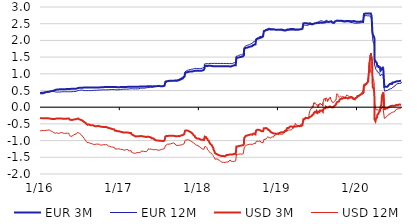
| Category | EUR 3M | EUR 12M | USD 3M | USD 12M |
|---|---|---|---|---|
| 2016-01-04 | 0.422 | 0.402 | -0.322 | -0.709 |
| 2016-01-05 | 0.423 | 0.401 | -0.327 | -0.713 |
| 2016-01-06 | 0.426 | 0.404 | -0.33 | -0.705 |
| 2016-01-07 | 0.432 | 0.409 | -0.327 | -0.687 |
| 2016-01-08 | 0.433 | 0.409 | -0.331 | -0.695 |
| 2016-01-11 | 0.433 | 0.4 | -0.332 | -0.704 |
| 2016-01-12 | 0.434 | 0.402 | -0.334 | -0.706 |
| 2016-01-13 | 0.434 | 0.401 | -0.332 | -0.713 |
| 2016-01-14 | 0.433 | 0.402 | -0.331 | -0.709 |
| 2016-01-15 | 0.432 | 0.401 | -0.33 | -0.695 |
| 2016-01-18 | 0.432 | 0.401 | -0.33 | -0.695 |
| 2016-01-19 | 0.432 | 0.401 | -0.33 | -0.695 |
| 2016-01-20 | 0.432 | 0.401 | -0.33 | -0.695 |
| 2016-01-21 | 0.432 | 0.401 | -0.33 | -0.695 |
| 2016-01-22 | 0.432 | 0.401 | -0.33 | -0.695 |
| 2016-01-25 | 0.445 | 0.422 | -0.331 | -0.703 |
| 2016-01-26 | 0.448 | 0.425 | -0.331 | -0.701 |
| 2016-01-27 | 0.449 | 0.428 | -0.328 | -0.7 |
| 2016-01-28 | 0.45 | 0.428 | -0.326 | -0.701 |
| 2016-01-29 | 0.452 | 0.435 | -0.323 | -0.69 |
| 2016-02-01 | 0.452 | 0.44 | -0.329 | -0.69 |
| 2016-02-02 | 0.451 | 0.441 | -0.329 | -0.688 |
| 2016-02-03 | 0.452 | 0.442 | -0.331 | -0.68 |
| 2016-02-04 | 0.456 | 0.448 | -0.33 | -0.679 |
| 2016-02-05 | 0.457 | 0.452 | -0.33 | -0.686 |
| 2016-02-08 | 0.459 | 0.455 | -0.331 | -0.69 |
| 2016-02-09 | 0.451 | 0.454 | -0.34 | -0.681 |
| 2016-02-10 | 0.455 | 0.451 | -0.338 | -0.684 |
| 2016-02-11 | 0.459 | 0.456 | -0.337 | -0.667 |
| 2016-02-12 | 0.463 | 0.459 | -0.338 | -0.666 |
| 2016-02-15 | 0.463 | 0.458 | -0.338 | -0.678 |
| 2016-02-16 | 0.467 | 0.462 | -0.338 | -0.682 |
| 2016-02-17 | 0.469 | 0.461 | -0.339 | -0.685 |
| 2016-02-18 | 0.475 | 0.464 | -0.338 | -0.692 |
| 2016-02-19 | 0.478 | 0.467 | -0.338 | -0.69 |
| 2016-02-22 | 0.479 | 0.468 | -0.345 | -0.709 |
| 2016-02-23 | 0.48 | 0.466 | -0.349 | -0.707 |
| 2016-02-24 | 0.481 | 0.465 | -0.355 | -0.705 |
| 2016-02-25 | 0.481 | 0.465 | -0.356 | -0.71 |
| 2016-02-26 | 0.482 | 0.467 | -0.355 | -0.711 |
| 2016-02-29 | 0.485 | 0.474 | -0.353 | -0.729 |
| 2016-03-01 | 0.487 | 0.476 | -0.352 | -0.729 |
| 2016-03-02 | 0.488 | 0.474 | -0.355 | -0.746 |
| 2016-03-03 | 0.493 | 0.475 | -0.356 | -0.75 |
| 2016-03-04 | 0.495 | 0.478 | -0.353 | -0.744 |
| 2016-03-07 | 0.496 | 0.474 | -0.356 | -0.762 |
| 2016-03-08 | 0.501 | 0.475 | -0.355 | -0.757 |
| 2016-03-09 | 0.504 | 0.473 | -0.355 | -0.759 |
| 2016-03-10 | 0.509 | 0.475 | -0.352 | -0.761 |
| 2016-03-11 | 0.515 | 0.459 | -0.344 | -0.774 |
| 2016-03-14 | 0.516 | 0.458 | -0.35 | -0.781 |
| 2016-03-15 | 0.517 | 0.456 | -0.352 | -0.787 |
| 2016-03-16 | 0.52 | 0.454 | -0.349 | -0.795 |
| 2016-03-17 | 0.524 | 0.453 | -0.333 | -0.752 |
| 2016-03-18 | 0.525 | 0.453 | -0.334 | -0.761 |
| 2016-03-21 | 0.528 | 0.452 | -0.335 | -0.764 |
| 2016-03-22 | 0.529 | 0.452 | -0.338 | -0.774 |
| 2016-03-23 | 0.531 | 0.453 | -0.34 | -0.787 |
| 2016-03-24 | 0.532 | 0.455 | -0.339 | -0.781 |
| 2016-03-29 | 0.532 | 0.456 | -0.341 | -0.789 |
| 2016-03-30 | 0.533 | 0.454 | -0.335 | -0.764 |
| 2016-03-31 | 0.534 | 0.455 | -0.339 | -0.76 |
| 2016-04-01 | 0.535 | 0.452 | -0.339 | -0.763 |
| 2016-04-04 | 0.536 | 0.451 | -0.34 | -0.772 |
| 2016-04-05 | 0.538 | 0.454 | -0.337 | -0.755 |
| 2016-04-06 | 0.538 | 0.455 | -0.341 | -0.762 |
| 2016-04-07 | 0.537 | 0.457 | -0.339 | -0.756 |
| 2016-04-08 | 0.538 | 0.46 | -0.341 | -0.755 |
| 2016-04-11 | 0.541 | 0.461 | -0.34 | -0.758 |
| 2016-04-12 | 0.539 | 0.462 | -0.34 | -0.759 |
| 2016-04-13 | 0.539 | 0.463 | -0.338 | -0.768 |
| 2016-04-14 | 0.541 | 0.461 | -0.343 | -0.771 |
| 2016-04-15 | 0.539 | 0.461 | -0.343 | -0.771 |
| 2016-04-18 | 0.539 | 0.462 | -0.344 | -0.768 |
| 2016-04-19 | 0.54 | 0.461 | -0.345 | -0.775 |
| 2016-04-20 | 0.54 | 0.461 | -0.345 | -0.775 |
| 2016-04-21 | 0.54 | 0.461 | -0.345 | -0.775 |
| 2016-04-22 | 0.54 | 0.461 | -0.345 | -0.775 |
| 2016-04-25 | 0.54 | 0.463 | -0.344 | -0.789 |
| 2016-04-26 | 0.542 | 0.464 | -0.344 | -0.793 |
| 2016-04-27 | 0.541 | 0.461 | -0.348 | -0.794 |
| 2016-04-28 | 0.542 | 0.462 | -0.347 | -0.78 |
| 2016-04-29 | 0.541 | 0.462 | -0.347 | -0.78 |
| 2016-05-02 | 0.54 | 0.462 | -0.347 | -0.78 |
| 2016-05-03 | 0.541 | 0.462 | -0.343 | -0.782 |
| 2016-05-04 | 0.543 | 0.462 | -0.344 | -0.78 |
| 2016-05-05 | 0.545 | 0.463 | -0.342 | -0.78 |
| 2016-05-06 | 0.546 | 0.463 | -0.34 | -0.774 |
| 2016-05-09 | 0.548 | 0.464 | -0.34 | -0.777 |
| 2016-05-10 | 0.55 | 0.463 | -0.338 | -0.774 |
| 2016-05-11 | 0.549 | 0.462 | -0.337 | -0.775 |
| 2016-05-12 | 0.548 | 0.462 | -0.336 | -0.777 |
| 2016-05-13 | 0.547 | 0.462 | -0.338 | -0.779 |
| 2016-05-16 | 0.547 | 0.462 | -0.336 | -0.783 |
| 2016-05-17 | 0.547 | 0.461 | -0.335 | -0.792 |
| 2016-05-18 | 0.547 | 0.461 | -0.346 | -0.82 |
| 2016-05-19 | 0.548 | 0.461 | -0.364 | -0.848 |
| 2016-05-20 | 0.548 | 0.461 | -0.371 | -0.852 |
| 2016-05-23 | 0.548 | 0.462 | -0.372 | -0.853 |
| 2016-05-24 | 0.548 | 0.462 | -0.375 | -0.862 |
| 2016-05-25 | 0.548 | 0.463 | -0.377 | -0.873 |
| 2016-05-26 | 0.548 | 0.464 | -0.384 | -0.871 |
| 2016-05-27 | 0.55 | 0.465 | -0.383 | -0.867 |
| 2016-05-30 | 0.551 | 0.465 | -0.383 | -0.867 |
| 2016-05-31 | 0.551 | 0.465 | -0.396 | -0.887 |
| 2016-06-01 | 0.551 | 0.468 | -0.391 | -0.878 |
| 2016-06-02 | 0.552 | 0.467 | -0.39 | -0.882 |
| 2016-06-03 | 0.551 | 0.466 | -0.392 | -0.881 |
| 2016-06-06 | 0.552 | 0.468 | -0.371 | -0.836 |
| 2016-06-07 | 0.551 | 0.468 | -0.367 | -0.835 |
| 2016-06-08 | 0.554 | 0.468 | -0.368 | -0.828 |
| 2016-06-09 | 0.552 | 0.468 | -0.366 | -0.824 |
| 2016-06-10 | 0.553 | 0.468 | -0.366 | -0.824 |
| 2016-06-13 | 0.553 | 0.47 | -0.362 | -0.809 |
| 2016-06-14 | 0.552 | 0.471 | -0.365 | -0.803 |
| 2016-06-15 | 0.552 | 0.471 | -0.366 | -0.815 |
| 2016-06-16 | 0.554 | 0.476 | -0.357 | -0.788 |
| 2016-06-17 | 0.555 | 0.476 | -0.354 | -0.791 |
| 2016-06-20 | 0.556 | 0.478 | -0.356 | -0.802 |
| 2016-06-21 | 0.556 | 0.479 | -0.352 | -0.802 |
| 2016-06-22 | 0.558 | 0.479 | -0.35 | -0.801 |
| 2016-06-23 | 0.559 | 0.479 | -0.35 | -0.8 |
| 2016-06-24 | 0.571 | 0.497 | -0.334 | -0.755 |
| 2016-06-27 | 0.573 | 0.498 | -0.337 | -0.746 |
| 2016-06-28 | 0.571 | 0.499 | -0.341 | -0.755 |
| 2016-06-29 | 0.572 | 0.501 | -0.356 | -0.766 |
| 2016-06-30 | 0.576 | 0.501 | -0.364 | -0.78 |
| 2016-07-01 | 0.58 | 0.502 | -0.363 | -0.775 |
| 2016-07-04 | 0.581 | 0.505 | -0.366 | -0.785 |
| 2016-07-07 | 0.583 | 0.513 | -0.375 | -0.796 |
| 2016-07-08 | 0.583 | 0.509 | -0.377 | -0.803 |
| 2016-07-11 | 0.582 | 0.513 | -0.379 | -0.82 |
| 2016-07-12 | 0.581 | 0.511 | -0.383 | -0.834 |
| 2016-07-13 | 0.585 | 0.511 | -0.39 | -0.843 |
| 2016-07-14 | 0.585 | 0.511 | -0.389 | -0.848 |
| 2016-07-15 | 0.583 | 0.507 | -0.398 | -0.858 |
| 2016-07-18 | 0.585 | 0.511 | -0.406 | -0.876 |
| 2016-07-19 | 0.585 | 0.509 | -0.407 | -0.879 |
| 2016-07-20 | 0.585 | 0.509 | -0.407 | -0.879 |
| 2016-07-21 | 0.585 | 0.509 | -0.407 | -0.879 |
| 2016-07-22 | 0.585 | 0.509 | -0.407 | -0.879 |
| 2016-07-25 | 0.587 | 0.499 | -0.444 | -0.936 |
| 2016-07-26 | 0.588 | 0.498 | -0.453 | -0.949 |
| 2016-07-27 | 0.588 | 0.499 | -0.461 | -0.964 |
| 2016-07-28 | 0.586 | 0.499 | -0.466 | -0.97 |
| 2016-07-29 | 0.587 | 0.499 | -0.469 | -0.982 |
| 2016-08-01 | 0.587 | 0.498 | -0.469 | -0.984 |
| 2016-08-02 | 0.588 | 0.498 | -0.478 | -0.993 |
| 2016-08-03 | 0.589 | 0.497 | -0.488 | -1.005 |
| 2016-08-04 | 0.588 | 0.495 | -0.498 | -1.027 |
| 2016-08-05 | 0.588 | 0.497 | -0.502 | -1.025 |
| 2016-08-08 | 0.588 | 0.496 | -0.516 | -1.058 |
| 2016-08-09 | 0.588 | 0.497 | -0.526 | -1.072 |
| 2016-08-10 | 0.587 | 0.498 | -0.528 | -1.074 |
| 2016-08-11 | 0.589 | 0.499 | -0.527 | -1.07 |
| 2016-08-12 | 0.589 | 0.499 | -0.528 | -1.076 |
| 2016-08-15 | 0.588 | 0.5 | -0.514 | -1.057 |
| 2016-08-16 | 0.589 | 0.5 | -0.511 | -1.048 |
| 2016-08-17 | 0.588 | 0.499 | -0.521 | -1.07 |
| 2016-08-18 | 0.589 | 0.498 | -0.521 | -1.065 |
| 2016-08-19 | 0.588 | 0.497 | -0.527 | -1.073 |
| 2016-08-22 | 0.589 | 0.496 | -0.535 | -1.083 |
| 2016-08-23 | 0.588 | 0.497 | -0.535 | -1.081 |
| 2016-08-24 | 0.588 | 0.498 | -0.535 | -1.077 |
| 2016-08-25 | 0.588 | 0.499 | -0.539 | -1.076 |
| 2016-08-26 | 0.588 | 0.5 | -0.543 | -1.087 |
| 2016-08-29 | 0.587 | 0.5 | -0.543 | -1.087 |
| 2016-08-30 | 0.589 | 0.501 | -0.552 | -1.109 |
| 2016-08-31 | 0.589 | 0.502 | -0.549 | -1.107 |
| 2016-09-01 | 0.589 | 0.501 | -0.546 | -1.116 |
| 2016-09-02 | 0.591 | 0.502 | -0.545 | -1.109 |
| 2016-09-05 | 0.591 | 0.502 | -0.543 | -1.112 |
| 2016-09-06 | 0.593 | 0.504 | -0.551 | -1.111 |
| 2016-09-07 | 0.593 | 0.509 | -0.544 | -1.089 |
| 2016-09-08 | 0.594 | 0.51 | -0.555 | -1.09 |
| 2016-09-09 | 0.591 | 0.507 | -0.562 | -1.107 |
| 2016-09-12 | 0.593 | 0.507 | -0.566 | -1.116 |
| 2016-09-13 | 0.592 | 0.505 | -0.56 | -1.104 |
| 2016-09-14 | 0.593 | 0.504 | -0.564 | -1.106 |
| 2016-09-15 | 0.591 | 0.503 | -0.567 | -1.1 |
| 2016-09-16 | 0.591 | 0.504 | -0.567 | -1.095 |
| 2016-09-19 | 0.591 | 0.506 | -0.571 | -1.106 |
| 2016-09-20 | 0.591 | 0.507 | -0.576 | -1.115 |
| 2016-09-21 | 0.591 | 0.508 | -0.573 | -1.121 |
| 2016-09-22 | 0.591 | 0.509 | -0.567 | -1.111 |
| 2016-09-23 | 0.592 | 0.509 | -0.563 | -1.107 |
| 2016-09-26 | 0.593 | 0.51 | -0.563 | -1.105 |
| 2016-09-27 | 0.591 | 0.51 | -0.564 | -1.101 |
| 2016-09-29 | 0.591 | 0.514 | -0.556 | -1.106 |
| 2016-09-30 | 0.591 | 0.514 | -0.564 | -1.102 |
| 2016-10-03 | 0.591 | 0.514 | -0.568 | -1.109 |
| 2016-10-04 | 0.591 | 0.514 | -0.574 | -1.116 |
| 2016-10-05 | 0.592 | 0.514 | -0.578 | -1.123 |
| 2016-10-06 | 0.594 | 0.514 | -0.582 | -1.131 |
| 2016-10-07 | 0.594 | 0.513 | -0.586 | -1.137 |
| 2016-10-10 | 0.595 | 0.514 | -0.584 | -1.136 |
| 2016-10-11 | 0.596 | 0.516 | -0.587 | -1.141 |
| 2016-10-12 | 0.599 | 0.519 | -0.591 | -1.146 |
| 2016-10-13 | 0.601 | 0.521 | -0.59 | -1.137 |
| 2016-10-14 | 0.601 | 0.522 | -0.592 | -1.136 |
| 2016-10-17 | 0.601 | 0.521 | -0.588 | -1.131 |
| 2016-10-18 | 0.602 | 0.523 | -0.591 | -1.121 |
| 2016-10-19 | 0.603 | 0.523 | -0.591 | -1.114 |
| 2016-10-20 | 0.603 | 0.523 | -0.592 | -1.116 |
| 2016-10-21 | 0.602 | 0.524 | -0.592 | -1.122 |
| 2016-10-24 | 0.601 | 0.52 | -0.594 | -1.121 |
| 2016-10-25 | 0.602 | 0.521 | -0.596 | -1.128 |
| 2016-10-26 | 0.603 | 0.52 | -0.6 | -1.13 |
| 2016-10-27 | 0.602 | 0.52 | -0.597 | -1.132 |
| 2016-10-31 | 0.603 | 0.519 | -0.594 | -1.125 |
| 2016-11-01 | 0.603 | 0.519 | -0.591 | -1.126 |
| 2016-11-02 | 0.603 | 0.521 | -0.586 | -1.115 |
| 2016-11-03 | 0.603 | 0.521 | -0.591 | -1.11 |
| 2016-11-04 | 0.602 | 0.521 | -0.593 | -1.109 |
| 2016-11-07 | 0.602 | 0.52 | -0.597 | -1.118 |
| 2016-11-08 | 0.602 | 0.52 | -0.592 | -1.118 |
| 2016-11-09 | 0.602 | 0.52 | -0.596 | -1.106 |
| 2016-11-10 | 0.602 | 0.521 | -0.612 | -1.133 |
| 2016-11-11 | 0.602 | 0.519 | -0.616 | -1.138 |
| 2016-11-14 | 0.602 | 0.52 | -0.621 | -1.16 |
| 2016-11-15 | 0.602 | 0.521 | -0.616 | -1.155 |
| 2016-11-16 | 0.601 | 0.523 | -0.619 | -1.162 |
| 2016-11-18 | 0.603 | 0.527 | -0.626 | -1.171 |
| 2016-11-21 | 0.602 | 0.528 | -0.63 | -1.173 |
| 2016-11-22 | 0.603 | 0.529 | -0.635 | -1.178 |
| 2016-11-23 | 0.603 | 0.528 | -0.64 | -1.18 |
| 2016-11-24 | 0.604 | 0.529 | -0.647 | -1.193 |
| 2016-11-25 | 0.604 | 0.529 | -0.647 | -1.195 |
| 2016-11-28 | 0.604 | 0.529 | -0.645 | -1.191 |
| 2016-11-29 | 0.604 | 0.529 | -0.641 | -1.191 |
| 2016-11-30 | 0.604 | 0.53 | -0.644 | -1.189 |
| 2016-12-01 | 0.603 | 0.529 | -0.652 | -1.193 |
| 2016-12-02 | 0.603 | 0.526 | -0.656 | -1.195 |
| 2016-12-05 | 0.603 | 0.528 | -0.658 | -1.194 |
| 2016-12-06 | 0.605 | 0.529 | -0.661 | -1.196 |
| 2016-12-07 | 0.606 | 0.528 | -0.661 | -1.195 |
| 2016-12-08 | 0.608 | 0.528 | -0.663 | -1.195 |
| 2016-12-09 | 0.606 | 0.531 | -0.667 | -1.198 |
| 2016-12-12 | 0.606 | 0.531 | -0.669 | -1.205 |
| 2016-12-13 | 0.606 | 0.531 | -0.673 | -1.204 |
| 2016-12-14 | 0.606 | 0.532 | -0.68 | -1.205 |
| 2016-12-15 | 0.606 | 0.531 | -0.703 | -1.25 |
| 2016-12-16 | 0.604 | 0.531 | -0.707 | -1.243 |
| 2016-12-19 | 0.603 | 0.521 | -0.704 | -1.252 |
| 2016-12-20 | 0.603 | 0.521 | -0.706 | -1.251 |
| 2016-12-21 | 0.605 | 0.522 | -0.708 | -1.25 |
| 2016-12-22 | 0.596 | 0.522 | -0.717 | -1.248 |
| 2016-12-23 | 0.597 | 0.522 | -0.717 | -1.25 |
| 2016-12-27 | 0.598 | 0.521 | -0.717 | -1.25 |
| 2016-12-28 | 0.589 | 0.512 | -0.728 | -1.26 |
| 2016-12-29 | 0.599 | 0.521 | -0.718 | -1.247 |
| 2016-12-30 | 0.599 | 0.522 | -0.718 | -1.246 |
| 2017-01-02 | 0.598 | 0.523 | -0.718 | -1.246 |
| 2017-01-03 | 0.599 | 0.524 | -0.719 | -1.249 |
| 2017-01-04 | 0.6 | 0.525 | -0.725 | -1.249 |
| 2017-01-05 | 0.601 | 0.525 | -0.729 | -1.249 |
| 2017-01-06 | 0.601 | 0.527 | -0.73 | -1.245 |
| 2017-01-09 | 0.602 | 0.528 | -0.735 | -1.261 |
| 2017-01-10 | 0.604 | 0.53 | -0.738 | -1.262 |
| 2017-01-11 | 0.606 | 0.531 | -0.742 | -1.263 |
| 2017-01-12 | 0.607 | 0.533 | -0.742 | -1.258 |
| 2017-01-13 | 0.607 | 0.534 | -0.743 | -1.258 |
| 2017-01-16 | 0.608 | 0.535 | -0.744 | -1.262 |
| 2017-01-17 | 0.609 | 0.538 | -0.745 | -1.262 |
| 2017-01-18 | 0.609 | 0.539 | -0.75 | -1.27 |
| 2017-01-19 | 0.609 | 0.54 | -0.761 | -1.288 |
| 2017-01-20 | 0.609 | 0.54 | -0.761 | -1.288 |
| 2017-01-23 | 0.607 | 0.541 | -0.758 | -1.281 |
| 2017-01-24 | 0.608 | 0.541 | -0.752 | -1.267 |
| 2017-01-25 | 0.608 | 0.541 | -0.757 | -1.279 |
| 2017-01-26 | 0.608 | 0.542 | -0.759 | -1.288 |
| 2017-01-27 | 0.608 | 0.541 | -0.759 | -1.284 |
| 2017-01-30 | 0.608 | 0.54 | -0.754 | -1.285 |
| 2017-01-31 | 0.607 | 0.541 | -0.755 | -1.273 |
| 2017-02-01 | 0.608 | 0.543 | -0.755 | -1.275 |
| 2017-02-02 | 0.608 | 0.542 | -0.754 | -1.272 |
| 2017-02-03 | 0.608 | 0.541 | -0.754 | -1.273 |
| 2017-02-06 | 0.608 | 0.541 | -0.758 | -1.267 |
| 2017-02-07 | 0.608 | 0.541 | -0.758 | -1.265 |
| 2017-02-08 | 0.608 | 0.541 | -0.754 | -1.26 |
| 2017-02-09 | 0.608 | 0.541 | -0.754 | -1.254 |
| 2017-02-10 | 0.609 | 0.541 | -0.756 | -1.263 |
| 2017-02-13 | 0.609 | 0.542 | -0.759 | -1.27 |
| 2017-02-14 | 0.608 | 0.544 | -0.757 | -1.268 |
| 2017-02-15 | 0.608 | 0.544 | -0.762 | -1.284 |
| 2017-02-16 | 0.608 | 0.546 | -0.776 | -1.305 |
| 2017-02-17 | 0.609 | 0.549 | -0.772 | -1.295 |
| 2017-02-20 | 0.609 | 0.549 | -0.77 | -1.295 |
| 2017-02-21 | 0.609 | 0.551 | -0.773 | -1.305 |
| 2017-02-22 | 0.61 | 0.551 | -0.774 | -1.306 |
| 2017-02-23 | 0.609 | 0.551 | -0.772 | -1.304 |
| 2017-02-24 | 0.609 | 0.553 | -0.774 | -1.3 |
| 2017-02-27 | 0.609 | 0.553 | -0.775 | -1.3 |
| 2017-02-28 | 0.61 | 0.554 | -0.784 | -1.316 |
| 2017-03-01 | 0.609 | 0.554 | -0.813 | -1.35 |
| 2017-03-02 | 0.609 | 0.554 | -0.82 | -1.358 |
| 2017-03-03 | 0.609 | 0.553 | -0.822 | -1.368 |
| 2017-03-06 | 0.609 | 0.551 | -0.826 | -1.36 |
| 2017-03-07 | 0.608 | 0.551 | -0.826 | -1.36 |
| 2017-03-08 | 0.609 | 0.551 | -0.829 | -1.361 |
| 2017-03-09 | 0.609 | 0.551 | -0.84 | -1.374 |
| 2017-03-10 | 0.609 | 0.549 | -0.841 | -1.378 |
| 2017-03-13 | 0.61 | 0.548 | -0.851 | -1.381 |
| 2017-03-14 | 0.61 | 0.548 | -0.857 | -1.383 |
| 2017-03-15 | 0.609 | 0.55 | -0.868 | -1.388 |
| 2017-03-16 | 0.609 | 0.551 | -0.872 | -1.374 |
| 2017-03-17 | 0.609 | 0.549 | -0.872 | -1.373 |
| 2017-03-20 | 0.609 | 0.549 | -0.876 | -1.376 |
| 2017-03-21 | 0.609 | 0.546 | -0.876 | -1.375 |
| 2017-03-22 | 0.61 | 0.546 | -0.877 | -1.367 |
| 2017-03-23 | 0.61 | 0.547 | -0.873 | -1.364 |
| 2017-03-24 | 0.61 | 0.547 | -0.871 | -1.363 |
| 2017-03-27 | 0.61 | 0.549 | -0.872 | -1.357 |
| 2017-03-28 | 0.61 | 0.55 | -0.872 | -1.358 |
| 2017-03-29 | 0.61 | 0.549 | -0.867 | -1.354 |
| 2017-03-30 | 0.61 | 0.549 | -0.868 | -1.353 |
| 2017-03-31 | 0.609 | 0.549 | -0.87 | -1.362 |
| 2017-04-03 | 0.61 | 0.551 | -0.87 | -1.363 |
| 2017-04-04 | 0.61 | 0.551 | -0.87 | -1.352 |
| 2017-04-05 | 0.609 | 0.554 | -0.87 | -1.356 |
| 2017-04-06 | 0.61 | 0.555 | -0.875 | -1.358 |
| 2017-04-07 | 0.62 | 0.556 | -0.868 | -1.359 |
| 2017-04-10 | 0.622 | 0.568 | -0.866 | -1.348 |
| 2017-04-11 | 0.622 | 0.569 | -0.865 | -1.339 |
| 2017-04-12 | 0.622 | 0.57 | -0.868 | -1.333 |
| 2017-04-13 | 0.621 | 0.57 | -0.868 | -1.322 |
| 2017-04-18 | 0.621 | 0.572 | -0.866 | -1.311 |
| 2017-04-19 | 0.622 | 0.573 | -0.866 | -1.286 |
| 2017-04-20 | 0.622 | 0.574 | -0.863 | -1.289 |
| 2017-04-21 | 0.621 | 0.574 | -0.866 | -1.295 |
| 2017-04-24 | 0.619 | 0.571 | -0.876 | -1.318 |
| 2017-04-25 | 0.619 | 0.571 | -0.88 | -1.325 |
| 2017-04-26 | 0.619 | 0.571 | -0.882 | -1.333 |
| 2017-04-27 | 0.619 | 0.571 | -0.88 | -1.326 |
| 2017-04-28 | 0.619 | 0.571 | -0.882 | -1.324 |
| 2017-05-02 | 0.619 | 0.571 | -0.884 | -1.33 |
| 2017-05-03 | 0.619 | 0.575 | -0.881 | -1.32 |
| 2017-05-04 | 0.619 | 0.576 | -0.889 | -1.331 |
| 2017-05-05 | 0.619 | 0.574 | -0.89 | -1.329 |
| 2017-05-09 | 0.619 | 0.583 | -0.892 | -1.331 |
| 2017-05-10 | 0.619 | 0.584 | -0.891 | -1.328 |
| 2017-05-11 | 0.629 | 0.584 | -0.882 | -1.326 |
| 2017-05-12 | 0.629 | 0.587 | -0.88 | -1.306 |
| 2017-05-15 | 0.63 | 0.587 | -0.879 | -1.285 |
| 2017-05-16 | 0.631 | 0.588 | -0.881 | -1.285 |
| 2017-05-17 | 0.631 | 0.589 | -0.878 | -1.273 |
| 2017-05-18 | 0.631 | 0.589 | -0.872 | -1.245 |
| 2017-05-19 | 0.631 | 0.589 | -0.886 | -1.263 |
| 2017-05-22 | 0.629 | 0.589 | -0.892 | -1.266 |
| 2017-05-23 | 0.63 | 0.589 | -0.889 | -1.26 |
| 2017-05-24 | 0.629 | 0.599 | -0.898 | -1.256 |
| 2017-05-25 | 0.629 | 0.599 | -0.9 | -1.253 |
| 2017-05-26 | 0.629 | 0.6 | -0.902 | -1.251 |
| 2017-05-29 | 0.629 | 0.601 | -0.902 | -1.251 |
| 2017-05-30 | 0.629 | 0.591 | -0.902 | -1.262 |
| 2017-05-31 | 0.629 | 0.591 | -0.91 | -1.264 |
| 2017-06-01 | 0.629 | 0.591 | -0.918 | -1.266 |
| 2017-06-02 | 0.619 | 0.591 | -0.932 | -1.271 |
| 2017-06-05 | 0.619 | 0.591 | -0.93 | -1.266 |
| 2017-06-06 | 0.619 | 0.593 | -0.929 | -1.263 |
| 2017-06-07 | 0.619 | 0.594 | -0.931 | -1.264 |
| 2017-06-08 | 0.62 | 0.594 | -0.938 | -1.268 |
| 2017-06-09 | 0.631 | 0.6 | -0.936 | -1.268 |
| 2017-06-12 | 0.631 | 0.607 | -0.942 | -1.276 |
| 2017-06-13 | 0.631 | 0.609 | -0.946 | -1.276 |
| 2017-06-14 | 0.631 | 0.612 | -0.95 | -1.276 |
| 2017-06-15 | 0.629 | 0.612 | -0.967 | -1.27 |
| 2017-06-16 | 0.629 | 0.614 | -0.974 | -1.272 |
| 2017-06-19 | 0.629 | 0.616 | -0.98 | -1.268 |
| 2017-06-20 | 0.629 | 0.619 | -0.987 | -1.276 |
| 2017-06-21 | 0.629 | 0.621 | -0.989 | -1.275 |
| 2017-06-22 | 0.63 | 0.621 | -0.996 | -1.278 |
| 2017-06-23 | 0.631 | 0.623 | -0.993 | -1.273 |
| 2017-06-26 | 0.631 | 0.621 | -0.995 | -1.275 |
| 2017-06-27 | 0.631 | 0.621 | -0.995 | -1.273 |
| 2017-06-28 | 0.631 | 0.618 | -0.996 | -1.277 |
| 2017-06-29 | 0.621 | 0.616 | -1.009 | -1.28 |
| 2017-06-30 | 0.631 | 0.616 | -0.999 | -1.278 |
| 2017-07-03 | 0.631 | 0.617 | -1.001 | -1.288 |
| 2017-07-04 | 0.629 | 0.619 | -1.002 | -1.291 |
| 2017-07-07 | 0.631 | 0.631 | -1.005 | -1.288 |
| 2017-07-10 | 0.631 | 0.626 | -1.004 | -1.281 |
| 2017-07-11 | 0.631 | 0.625 | -1.004 | -1.282 |
| 2017-07-12 | 0.631 | 0.624 | -1.004 | -1.276 |
| 2017-07-13 | 0.631 | 0.621 | -1.004 | -1.268 |
| 2017-07-14 | 0.631 | 0.621 | -1.004 | -1.27 |
| 2017-07-17 | 0.63 | 0.621 | -1.006 | -1.263 |
| 2017-07-18 | 0.631 | 0.621 | -1.007 | -1.263 |
| 2017-07-19 | 0.632 | 0.621 | -1.007 | -1.263 |
| 2017-07-20 | 0.632 | 0.621 | -1.007 | -1.263 |
| 2017-07-21 | 0.632 | 0.621 | -1.007 | -1.263 |
| 2017-07-24 | 0.629 | 0.633 | -1.014 | -1.256 |
| 2017-07-25 | 0.629 | 0.633 | -1.017 | -1.259 |
| 2017-07-26 | 0.63 | 0.633 | -1.014 | -1.256 |
| 2017-07-27 | 0.629 | 0.633 | -1.011 | -1.25 |
| 2017-07-28 | 0.639 | 0.632 | -1.001 | -1.249 |
| 2017-07-31 | 0.64 | 0.641 | -1.001 | -1.237 |
| 2017-08-01 | 0.641 | 0.641 | -1.001 | -1.236 |
| 2017-08-02 | 0.641 | 0.643 | -1.003 | -1.236 |
| 2017-08-03 | 0.639 | 0.642 | -1.002 | -1.236 |
| 2017-08-04 | 0.759 | 0.711 | -0.882 | -1.163 |
| 2017-08-07 | 0.768 | 0.742 | -0.871 | -1.142 |
| 2017-08-08 | 0.768 | 0.752 | -0.869 | -1.13 |
| 2017-08-09 | 0.778 | 0.753 | -0.859 | -1.128 |
| 2017-08-10 | 0.779 | 0.764 | -0.859 | -1.118 |
| 2017-08-11 | 0.779 | 0.766 | -0.865 | -1.115 |
| 2017-08-14 | 0.779 | 0.768 | -0.864 | -1.108 |
| 2017-08-15 | 0.779 | 0.767 | -0.864 | -1.118 |
| 2017-08-16 | 0.779 | 0.777 | -0.867 | -1.116 |
| 2017-08-17 | 0.789 | 0.778 | -0.856 | -1.113 |
| 2017-08-18 | 0.789 | 0.778 | -0.855 | -1.106 |
| 2017-08-21 | 0.789 | 0.778 | -0.854 | -1.107 |
| 2017-08-22 | 0.788 | 0.788 | -0.857 | -1.097 |
| 2017-08-23 | 0.789 | 0.789 | -0.857 | -1.098 |
| 2017-08-24 | 0.789 | 0.789 | -0.857 | -1.093 |
| 2017-08-25 | 0.789 | 0.789 | -0.858 | -1.098 |
| 2017-08-28 | 0.789 | 0.789 | -0.858 | -1.098 |
| 2017-08-29 | 0.79 | 0.79 | -0.857 | -1.084 |
| 2017-08-30 | 0.79 | 0.791 | -0.856 | -1.082 |
| 2017-08-31 | 0.789 | 0.791 | -0.858 | -1.083 |
| 2017-09-01 | 0.789 | 0.791 | -0.856 | -1.082 |
| 2017-09-04 | 0.789 | 0.791 | -0.856 | -1.083 |
| 2017-09-05 | 0.789 | 0.791 | -0.857 | -1.085 |
| 2017-09-06 | 0.789 | 0.793 | -0.857 | -1.078 |
| 2017-09-07 | 0.79 | 0.792 | -0.857 | -1.079 |
| 2017-09-08 | 0.791 | 0.796 | -0.85 | -1.065 |
| 2017-09-11 | 0.791 | 0.798 | -0.857 | -1.069 |
| 2017-09-12 | 0.79 | 0.809 | -0.859 | -1.07 |
| 2017-09-13 | 0.789 | 0.809 | -0.86 | -1.072 |
| 2017-09-14 | 0.789 | 0.811 | -0.861 | -1.08 |
| 2017-09-15 | 0.789 | 0.811 | -0.864 | -1.092 |
| 2017-09-18 | 0.789 | 0.811 | -0.865 | -1.1 |
| 2017-09-19 | 0.79 | 0.811 | -0.866 | -1.104 |
| 2017-09-20 | 0.789 | 0.811 | -0.863 | -1.107 |
| 2017-09-21 | 0.79 | 0.811 | -0.868 | -1.128 |
| 2017-09-22 | 0.789 | 0.811 | -0.869 | -1.135 |
| 2017-09-25 | 0.789 | 0.811 | -0.87 | -1.135 |
| 2017-09-26 | 0.789 | 0.811 | -0.871 | -1.136 |
| 2017-09-27 | 0.799 | 0.811 | -0.863 | -1.145 |
| 2017-09-29 | 0.799 | 0.822 | -0.864 | -1.132 |
| 2017-10-02 | 0.799 | 0.822 | -0.866 | -1.141 |
| 2017-10-03 | 0.8 | 0.821 | -0.872 | -1.149 |
| 2017-10-04 | 0.799 | 0.818 | -0.877 | -1.148 |
| 2017-10-05 | 0.809 | 0.831 | -0.869 | -1.14 |
| 2017-10-06 | 0.819 | 0.833 | -0.86 | -1.145 |
| 2017-10-09 | 0.819 | 0.846 | -0.866 | -1.139 |
| 2017-10-10 | 0.819 | 0.851 | -0.867 | -1.137 |
| 2017-10-11 | 0.819 | 0.841 | -0.869 | -1.15 |
| 2017-10-12 | 0.819 | 0.841 | -0.869 | -1.148 |
| 2017-10-13 | 0.829 | 0.851 | -0.853 | -1.143 |
| 2017-10-16 | 0.839 | 0.862 | -0.844 | -1.13 |
| 2017-10-17 | 0.839 | 0.873 | -0.847 | -1.131 |
| 2017-10-18 | 0.849 | 0.883 | -0.843 | -1.135 |
| 2017-10-19 | 0.849 | 0.893 | -0.842 | -1.118 |
| 2017-10-20 | 0.849 | 0.893 | -0.842 | -1.118 |
| 2017-10-23 | 0.859 | 0.903 | -0.837 | -1.115 |
| 2017-10-24 | 0.87 | 0.903 | -0.831 | -1.115 |
| 2017-10-25 | 0.871 | 0.913 | -0.834 | -1.115 |
| 2017-10-26 | 0.881 | 0.923 | -0.828 | -1.103 |
| 2017-10-27 | 0.891 | 0.924 | -0.82 | -1.108 |
| 2017-10-30 | 0.901 | 0.935 | -0.807 | -1.092 |
| 2017-10-31 | 0.911 | 0.955 | -0.801 | -1.078 |
| 2017-11-01 | 0.919 | 0.957 | -0.795 | -1.086 |
| 2017-11-02 | 0.939 | 0.979 | -0.781 | -1.073 |
| 2017-11-03 | 1.019 | 1.061 | -0.702 | -0.993 |
| 2017-11-06 | 1.029 | 1.081 | -0.697 | -0.974 |
| 2017-11-07 | 1.029 | 1.08 | -0.703 | -0.978 |
| 2017-11-08 | 1.039 | 1.081 | -0.7 | -0.983 |
| 2017-11-09 | 1.049 | 1.091 | -0.693 | -0.982 |
| 2017-11-10 | 1.049 | 1.101 | -0.693 | -0.971 |
| 2017-11-13 | 1.049 | 1.101 | -0.696 | -0.974 |
| 2017-11-14 | 1.049 | 1.111 | -0.699 | -0.973 |
| 2017-11-15 | 1.049 | 1.112 | -0.702 | -0.966 |
| 2017-11-16 | 1.049 | 1.122 | -0.716 | -0.971 |
| 2017-11-20 | 1.059 | 1.117 | -0.716 | -0.978 |
| 2017-11-21 | 1.059 | 1.126 | -0.724 | -0.987 |
| 2017-11-22 | 1.059 | 1.126 | -0.732 | -0.994 |
| 2017-11-23 | 1.059 | 1.126 | -0.732 | -0.99 |
| 2017-11-24 | 1.069 | 1.126 | -0.728 | -0.996 |
| 2017-11-27 | 1.069 | 1.126 | -0.737 | -1.003 |
| 2017-11-28 | 1.069 | 1.126 | -0.739 | -0.998 |
| 2017-11-29 | 1.069 | 1.137 | -0.741 | -0.995 |
| 2017-11-30 | 1.069 | 1.138 | -0.747 | -1.002 |
| 2017-12-01 | 1.066 | 1.128 | -0.755 | -1.02 |
| 2017-12-04 | 1.066 | 1.14 | -0.768 | -1.032 |
| 2017-12-05 | 1.066 | 1.141 | -0.775 | -1.04 |
| 2017-12-06 | 1.066 | 1.141 | -0.783 | -1.038 |
| 2017-12-07 | 1.065 | 1.14 | -0.796 | -1.047 |
| 2017-12-08 | 1.076 | 1.141 | -0.799 | -1.061 |
| 2017-12-11 | 1.077 | 1.141 | -0.813 | -1.064 |
| 2017-12-12 | 1.077 | 1.141 | -0.824 | -1.078 |
| 2017-12-13 | 1.079 | 1.151 | -0.838 | -1.079 |
| 2017-12-14 | 1.091 | 1.162 | -0.84 | -1.069 |
| 2017-12-15 | 1.089 | 1.163 | -0.853 | -1.078 |
| 2017-12-18 | 1.089 | 1.164 | -0.865 | -1.088 |
| 2017-12-19 | 1.089 | 1.164 | -0.882 | -1.099 |
| 2017-12-20 | 1.089 | 1.158 | -0.898 | -1.114 |
| 2017-12-21 | 1.089 | 1.156 | -0.915 | -1.121 |
| 2017-12-22 | 1.089 | 1.156 | -0.926 | -1.132 |
| 2017-12-27 | 1.089 | 1.156 | -0.933 | -1.141 |
| 2017-12-28 | 1.089 | 1.156 | -0.935 | -1.136 |
| 2017-12-29 | 1.089 | 1.156 | -0.934 | -1.137 |
| 2018-01-02 | 1.089 | 1.156 | -0.937 | -1.139 |
| 2018-01-03 | 1.089 | 1.157 | -0.936 | -1.148 |
| 2018-01-04 | 1.089 | 1.157 | -0.944 | -1.168 |
| 2018-01-05 | 1.089 | 1.157 | -0.944 | -1.18 |
| 2018-01-08 | 1.089 | 1.157 | -0.948 | -1.181 |
| 2018-01-09 | 1.089 | 1.157 | -0.945 | -1.176 |
| 2018-01-10 | 1.089 | 1.156 | -0.949 | -1.186 |
| 2018-01-11 | 1.109 | 1.178 | -0.94 | -1.174 |
| 2018-01-12 | 1.089 | 1.156 | -0.962 | -1.203 |
| 2018-01-15 | 1.089 | 1.157 | -0.971 | -1.219 |
| 2018-01-16 | 1.089 | 1.156 | -0.974 | -1.226 |
| 2018-01-17 | 1.098 | 1.166 | -0.969 | -1.234 |
| 2018-01-18 | 1.098 | 1.171 | -0.975 | -1.248 |
| 2018-01-19 | 1.098 | 1.171 | -0.974 | -1.248 |
| 2018-01-22 | 1.098 | 1.171 | -0.971 | -1.248 |
| 2018-01-23 | 1.098 | 1.171 | -0.975 | -1.245 |
| 2018-01-24 | 1.098 | 1.172 | -0.982 | -1.251 |
| 2018-01-25 | 1.108 | 1.182 | -0.972 | -1.241 |
| 2018-01-26 | 1.108 | 1.182 | -0.972 | -1.241 |
| 2018-01-29 | 1.118 | 1.191 | -0.982 | -1.264 |
| 2018-01-30 | 1.138 | 1.201 | -0.963 | -1.253 |
| 2018-01-31 | 1.138 | 1.211 | -0.968 | -1.247 |
| 2018-02-01 | 1.158 | 1.221 | -0.957 | -1.263 |
| 2018-02-02 | 1.239 | 1.301 | -0.879 | -1.181 |
| 2018-02-05 | 1.239 | 1.301 | -0.883 | -1.183 |
| 2018-02-06 | 1.239 | 1.301 | -0.881 | -1.168 |
| 2018-02-07 | 1.239 | 1.301 | -0.89 | -1.176 |
| 2018-02-08 | 1.239 | 1.301 | -0.9 | -1.188 |
| 2018-02-09 | 1.229 | 1.301 | -0.92 | -1.203 |
| 2018-02-12 | 1.229 | 1.301 | -0.933 | -1.209 |
| 2018-02-13 | 1.229 | 1.301 | -0.939 | -1.217 |
| 2018-02-14 | 1.228 | 1.302 | -0.95 | -1.228 |
| 2018-02-15 | 1.228 | 1.301 | -0.972 | -1.271 |
| 2018-02-16 | 1.228 | 1.302 | -0.985 | -1.281 |
| 2018-02-19 | 1.239 | 1.303 | -0.982 | -1.288 |
| 2018-02-20 | 1.239 | 1.303 | -0.994 | -1.298 |
| 2018-02-21 | 1.239 | 1.301 | -1.01 | -1.316 |
| 2018-02-22 | 1.238 | 1.311 | -1.034 | -1.33 |
| 2018-02-23 | 1.238 | 1.311 | -1.046 | -1.34 |
| 2018-02-26 | 1.238 | 1.31 | -1.074 | -1.349 |
| 2018-02-27 | 1.238 | 1.311 | -1.096 | -1.361 |
| 2018-02-28 | 1.237 | 1.311 | -1.107 | -1.382 |
| 2018-03-01 | 1.237 | 1.311 | -1.115 | -1.387 |
| 2018-03-02 | 1.237 | 1.311 | -1.115 | -1.377 |
| 2018-03-05 | 1.237 | 1.311 | -1.125 | -1.378 |
| 2018-03-06 | 1.237 | 1.311 | -1.137 | -1.392 |
| 2018-03-07 | 1.237 | 1.311 | -1.147 | -1.399 |
| 2018-03-08 | 1.237 | 1.311 | -1.161 | -1.413 |
| 2018-03-09 | 1.227 | 1.311 | -1.189 | -1.424 |
| 2018-03-12 | 1.227 | 1.311 | -1.207 | -1.443 |
| 2018-03-13 | 1.227 | 1.311 | -1.224 | -1.458 |
| 2018-03-14 | 1.227 | 1.311 | -1.245 | -1.47 |
| 2018-03-15 | 1.228 | 1.311 | -1.278 | -1.481 |
| 2018-03-16 | 1.228 | 1.312 | -1.302 | -1.494 |
| 2018-03-19 | 1.229 | 1.312 | -1.322 | -1.513 |
| 2018-03-20 | 1.229 | 1.311 | -1.348 | -1.531 |
| 2018-03-21 | 1.229 | 1.311 | -1.371 | -1.556 |
| 2018-03-22 | 1.229 | 1.311 | -1.386 | -1.557 |
| 2018-03-23 | 1.229 | 1.31 | -1.392 | -1.546 |
| 2018-03-26 | 1.229 | 1.311 | -1.395 | -1.552 |
| 2018-03-27 | 1.229 | 1.311 | -1.402 | -1.551 |
| 2018-03-28 | 1.229 | 1.311 | -1.408 | -1.539 |
| 2018-03-29 | 1.228 | 1.31 | -1.412 | -1.543 |
| 2018-04-03 | 1.228 | 1.31 | -1.421 | -1.55 |
| 2018-04-04 | 1.228 | 1.31 | -1.425 | -1.561 |
| 2018-04-05 | 1.228 | 1.311 | -1.431 | -1.58 |
| 2018-04-06 | 1.229 | 1.311 | -1.437 | -1.588 |
| 2018-04-09 | 1.229 | 1.311 | -1.437 | -1.584 |
| 2018-04-10 | 1.229 | 1.311 | -1.439 | -1.584 |
| 2018-04-11 | 1.229 | 1.31 | -1.442 | -1.589 |
| 2018-04-12 | 1.229 | 1.311 | -1.448 | -1.597 |
| 2018-04-13 | 1.229 | 1.31 | -1.453 | -1.611 |
| 2018-04-16 | 1.229 | 1.309 | -1.455 | -1.624 |
| 2018-04-17 | 1.228 | 1.319 | -1.455 | -1.616 |
| 2018-04-18 | 1.228 | 1.309 | -1.459 | -1.628 |
| 2018-04-19 | 1.228 | 1.309 | -1.459 | -1.628 |
| 2018-04-20 | 1.228 | 1.309 | -1.459 | -1.628 |
| 2018-04-23 | 1.228 | 1.309 | -1.46 | -1.649 |
| 2018-04-24 | 1.228 | 1.309 | -1.462 | -1.649 |
| 2018-04-25 | 1.228 | 1.309 | -1.466 | -1.652 |
| 2018-04-26 | 1.228 | 1.309 | -1.459 | -1.65 |
| 2018-04-27 | 1.229 | 1.309 | -1.458 | -1.66 |
| 2018-04-30 | 1.229 | 1.309 | -1.463 | -1.65 |
| 2018-05-02 | 1.229 | 1.309 | -1.463 | -1.657 |
| 2018-05-03 | 1.228 | 1.309 | -1.463 | -1.653 |
| 2018-05-04 | 1.228 | 1.31 | -1.469 | -1.657 |
| 2018-05-07 | 1.228 | 1.309 | -1.469 | -1.657 |
| 2018-05-09 | 1.227 | 1.309 | -1.456 | -1.651 |
| 2018-05-10 | 1.226 | 1.309 | -1.455 | -1.648 |
| 2018-05-11 | 1.227 | 1.309 | -1.442 | -1.646 |
| 2018-05-14 | 1.226 | 1.31 | -1.43 | -1.637 |
| 2018-05-15 | 1.226 | 1.308 | -1.421 | -1.634 |
| 2018-05-16 | 1.226 | 1.308 | -1.426 | -1.641 |
| 2018-05-17 | 1.226 | 1.308 | -1.431 | -1.646 |
| 2018-05-18 | 1.226 | 1.309 | -1.429 | -1.645 |
| 2018-05-21 | 1.225 | 1.307 | -1.43 | -1.645 |
| 2018-05-22 | 1.224 | 1.309 | -1.43 | -1.644 |
| 2018-05-23 | 1.223 | 1.309 | -1.43 | -1.634 |
| 2018-05-24 | 1.224 | 1.307 | -1.419 | -1.617 |
| 2018-05-25 | 1.223 | 1.308 | -1.418 | -1.611 |
| 2018-05-28 | 1.222 | 1.306 | -1.418 | -1.611 |
| 2018-05-29 | 1.221 | 1.306 | -1.407 | -1.588 |
| 2018-05-30 | 1.221 | 1.304 | -1.4 | -1.58 |
| 2018-05-31 | 1.221 | 1.304 | -1.421 | -1.598 |
| 2018-06-01 | 1.221 | 1.304 | -1.418 | -1.604 |
| 2018-06-04 | 1.221 | 1.304 | -1.414 | -1.62 |
| 2018-06-05 | 1.222 | 1.302 | -1.419 | -1.619 |
| 2018-06-06 | 1.221 | 1.3 | -1.421 | -1.621 |
| 2018-06-07 | 1.221 | 1.3 | -1.427 | -1.634 |
| 2018-06-08 | 1.221 | 1.3 | -1.426 | -1.62 |
| 2018-06-11 | 1.241 | 1.311 | -1.413 | -1.628 |
| 2018-06-12 | 1.241 | 1.321 | -1.416 | -1.625 |
| 2018-06-13 | 1.241 | 1.321 | -1.421 | -1.627 |
| 2018-06-14 | 1.251 | 1.321 | -1.405 | -1.632 |
| 2018-06-15 | 1.241 | 1.323 | -1.406 | -1.632 |
| 2018-06-18 | 1.253 | 1.334 | -1.395 | -1.622 |
| 2018-06-19 | 1.253 | 1.331 | -1.4 | -1.613 |
| 2018-06-20 | 1.253 | 1.332 | -1.402 | -1.622 |
| 2018-06-21 | 1.253 | 1.332 | -1.405 | -1.62 |
| 2018-06-22 | 1.253 | 1.34 | -1.409 | -1.617 |
| 2018-06-25 | 1.254 | 1.341 | -1.407 | -1.606 |
| 2018-06-26 | 1.253 | 1.341 | -1.406 | -1.611 |
| 2018-06-27 | 1.254 | 1.341 | -1.404 | -1.603 |
| 2018-06-28 | 1.484 | 1.531 | -1.177 | -1.413 |
| 2018-06-29 | 1.481 | 1.531 | -1.176 | -1.414 |
| 2018-07-02 | 1.481 | 1.531 | -1.182 | -1.422 |
| 2018-07-03 | 1.481 | 1.531 | -1.177 | -1.423 |
| 2018-07-04 | 1.491 | 1.541 | -1.167 | -1.413 |
| 2018-07-09 | 1.491 | 1.551 | -1.163 | -1.406 |
| 2018-07-10 | 1.491 | 1.55 | -1.167 | -1.411 |
| 2018-07-11 | 1.501 | 1.559 | -1.157 | -1.398 |
| 2018-07-12 | 1.501 | 1.559 | -1.159 | -1.405 |
| 2018-07-13 | 1.501 | 1.569 | -1.156 | -1.397 |
| 2018-07-16 | 1.501 | 1.569 | -1.153 | -1.398 |
| 2018-07-17 | 1.511 | 1.579 | -1.152 | -1.396 |
| 2018-07-18 | 1.501 | 1.569 | -1.168 | -1.411 |
| 2018-07-19 | 1.511 | 1.569 | -1.157 | -1.417 |
| 2018-07-20 | 1.501 | 1.569 | -1.162 | -1.412 |
| 2018-07-23 | 1.511 | 1.569 | -1.145 | -1.409 |
| 2018-07-24 | 1.511 | 1.579 | -1.145 | -1.408 |
| 2018-07-25 | 1.521 | 1.589 | -1.137 | -1.398 |
| 2018-07-26 | 1.52 | 1.589 | -1.139 | -1.407 |
| 2018-07-27 | 1.52 | 1.589 | -1.142 | -1.411 |
| 2018-07-30 | 1.529 | 1.609 | -1.133 | -1.391 |
| 2018-07-31 | 1.539 | 1.608 | -1.129 | -1.398 |
| 2018-08-01 | 1.549 | 1.627 | -1.118 | -1.382 |
| 2018-08-02 | 1.559 | 1.626 | -1.1 | -1.378 |
| 2018-08-03 | 1.739 | 1.786 | -0.923 | -1.217 |
| 2018-08-06 | 1.759 | 1.816 | -0.903 | -1.187 |
| 2018-08-07 | 1.769 | 1.826 | -0.891 | -1.174 |
| 2018-08-08 | 1.769 | 1.836 | -0.891 | -1.168 |
| 2018-08-09 | 1.779 | 1.843 | -0.878 | -1.158 |
| 2018-08-10 | 1.779 | 1.839 | -0.859 | -1.146 |
| 2018-08-13 | 1.779 | 1.846 | -0.854 | -1.123 |
| 2018-08-14 | 1.779 | 1.846 | -0.855 | -1.134 |
| 2018-08-15 | 1.779 | 1.846 | -0.852 | -1.135 |
| 2018-08-16 | 1.779 | 1.846 | -0.862 | -1.137 |
| 2018-08-17 | 1.789 | 1.847 | -0.842 | -1.133 |
| 2018-08-20 | 1.789 | 1.857 | -0.84 | -1.123 |
| 2018-08-21 | 1.799 | 1.867 | -0.83 | -1.108 |
| 2018-08-22 | 1.799 | 1.877 | -0.832 | -1.098 |
| 2018-08-23 | 1.799 | 1.877 | -0.831 | -1.102 |
| 2018-08-24 | 1.799 | 1.876 | -0.837 | -1.11 |
| 2018-08-27 | 1.809 | 1.876 | -0.827 | -1.11 |
| 2018-08-28 | 1.809 | 1.886 | -0.825 | -1.108 |
| 2018-08-29 | 1.809 | 1.885 | -0.823 | -1.113 |
| 2018-08-30 | 1.809 | 1.896 | -0.831 | -1.112 |
| 2018-08-31 | 1.819 | 1.896 | -0.821 | -1.11 |
| 2018-09-03 | 1.819 | 1.896 | -0.816 | -1.109 |
| 2018-09-04 | 1.819 | 1.906 | -0.823 | -1.103 |
| 2018-09-05 | 1.829 | 1.907 | -0.807 | -1.104 |
| 2018-09-06 | 1.829 | 1.917 | -0.817 | -1.099 |
| 2018-09-07 | 1.829 | 1.907 | -0.821 | -1.106 |
| 2018-09-10 | 1.829 | 1.917 | -0.824 | -1.113 |
| 2018-09-11 | 1.839 | 1.936 | -0.814 | -1.098 |
| 2018-09-12 | 1.849 | 1.946 | -0.802 | -1.085 |
| 2018-09-13 | 1.859 | 1.948 | -0.794 | -1.093 |
| 2018-09-14 | 1.859 | 1.958 | -0.797 | -1.09 |
| 2018-09-17 | 1.859 | 1.959 | -0.799 | -1.089 |
| 2018-09-18 | 1.869 | 1.968 | -0.787 | -1.08 |
| 2018-09-19 | 1.878 | 1.977 | -0.793 | -1.077 |
| 2018-09-20 | 1.879 | 1.978 | -0.806 | -1.087 |
| 2018-09-21 | 1.879 | 1.988 | -0.813 | -1.088 |
| 2018-09-24 | 1.879 | 1.987 | -0.814 | -1.089 |
| 2018-09-25 | 1.889 | 1.985 | -0.811 | -1.092 |
| 2018-09-26 | 1.899 | 1.994 | -0.806 | -1.084 |
| 2018-09-27 | 2.018 | 2.051 | -0.696 | -1.027 |
| 2018-10-01 | 2.037 | 2.058 | -0.678 | -1.026 |
| 2018-10-02 | 2.048 | 2.067 | -0.678 | -1.015 |
| 2018-10-03 | 2.048 | 2.077 | -0.678 | -1.007 |
| 2018-10-04 | 2.058 | 2.089 | -0.67 | -1.027 |
| 2018-10-05 | 2.058 | 2.088 | -0.668 | -1.028 |
| 2018-10-08 | 2.058 | 2.088 | -0.674 | -1.028 |
| 2018-10-09 | 2.068 | 2.086 | -0.67 | -1.032 |
| 2018-10-10 | 2.068 | 2.096 | -0.675 | -1.029 |
| 2018-10-11 | 2.068 | 2.106 | -0.686 | -1.004 |
| 2018-10-12 | 2.068 | 2.117 | -0.686 | -1.003 |
| 2018-10-15 | 2.078 | 2.116 | -0.689 | -1.007 |
| 2018-10-16 | 2.078 | 2.126 | -0.689 | -0.997 |
| 2018-10-17 | 2.078 | 2.126 | -0.69 | -0.996 |
| 2018-10-18 | 2.077 | 2.125 | -0.709 | -1.031 |
| 2018-10-19 | 2.087 | 2.124 | -0.707 | -1.05 |
| 2018-10-22 | 2.087 | 2.121 | -0.717 | -1.061 |
| 2018-10-23 | 2.087 | 2.129 | -0.72 | -1.054 |
| 2018-10-24 | 2.097 | 2.129 | -0.71 | -1.054 |
| 2018-10-25 | 2.097 | 2.119 | -0.71 | -1.064 |
| 2018-10-26 | 2.108 | 2.128 | -0.73 | -1.077 |
| 2018-10-29 | 2.118 | 2.138 | -0.72 | -1.067 |
| 2018-10-30 | 2.118 | 2.138 | -0.72 | -1.067 |
| 2018-10-31 | 2.128 | 2.149 | -0.748 | -1.084 |
| 2018-11-01 | 2.138 | 2.159 | -0.739 | -1.074 |
| 2018-11-02 | 2.278 | 2.288 | -0.632 | -0.965 |
| 2018-11-05 | 2.288 | 2.288 | -0.619 | -0.977 |
| 2018-11-06 | 2.288 | 2.298 | -0.619 | -0.967 |
| 2018-11-07 | 2.287 | 2.309 | -0.631 | -0.965 |
| 2018-11-08 | 2.297 | 2.319 | -0.621 | -0.955 |
| 2018-11-09 | 2.306 | 2.328 | -0.628 | -0.964 |
| 2018-11-12 | 2.306 | 2.328 | -0.624 | -0.955 |
| 2018-11-13 | 2.306 | 2.328 | -0.624 | -0.955 |
| 2018-11-14 | 2.306 | 2.337 | -0.639 | -0.94 |
| 2018-11-15 | 2.316 | 2.347 | -0.64 | -0.918 |
| 2018-11-16 | 2.316 | 2.347 | -0.64 | -0.918 |
| 2018-11-19 | 2.316 | 2.348 | -0.646 | -0.907 |
| 2018-11-20 | 2.326 | 2.358 | -0.643 | -0.887 |
| 2018-11-21 | 2.326 | 2.358 | -0.643 | -0.887 |
| 2018-11-22 | 2.326 | 2.358 | -0.679 | -0.9 |
| 2018-11-23 | 2.336 | 2.367 | -0.671 | -0.901 |
| 2018-11-26 | 2.336 | 2.366 | -0.687 | -0.908 |
| 2018-11-27 | 2.336 | 2.366 | -0.687 | -0.908 |
| 2018-11-28 | 2.336 | 2.366 | -0.687 | -0.908 |
| 2018-11-29 | 2.336 | 2.366 | -0.687 | -0.908 |
| 2018-11-30 | 2.336 | 2.366 | -0.716 | -0.9 |
| 2018-12-03 | 2.326 | 2.353 | -0.741 | -0.928 |
| 2018-12-04 | 2.326 | 2.352 | -0.729 | -0.923 |
| 2018-12-05 | 2.326 | 2.351 | -0.756 | -0.916 |
| 2018-12-06 | 2.325 | 2.35 | -0.757 | -0.902 |
| 2018-12-07 | 2.325 | 2.347 | -0.761 | -0.891 |
| 2018-12-10 | 2.324 | 2.344 | -0.766 | -0.874 |
| 2018-12-11 | 2.322 | 2.341 | -0.769 | -0.88 |
| 2018-12-12 | 2.322 | 2.341 | -0.768 | -0.891 |
| 2018-12-13 | 2.331 | 2.339 | -0.768 | -0.902 |
| 2018-12-14 | 2.331 | 2.338 | -0.781 | -0.888 |
| 2018-12-17 | 2.331 | 2.337 | -0.784 | -0.894 |
| 2018-12-18 | 2.331 | 2.335 | -0.772 | -0.851 |
| 2018-12-19 | 2.329 | 2.334 | -0.77 | -0.843 |
| 2018-12-20 | 2.329 | 2.334 | -0.77 | -0.843 |
| 2018-12-21 | 2.329 | 2.334 | -0.77 | -0.843 |
| 2018-12-27 | 2.319 | 2.319 | -0.793 | -0.832 |
| 2018-12-28 | 2.33 | 2.329 | -0.777 | -0.803 |
| 2018-12-31 | 2.319 | 2.327 | -0.798 | -0.795 |
| 2019-01-02 | 2.319 | 2.317 | -0.798 | -0.805 |
| 2019-01-03 | 2.319 | 2.317 | -0.798 | -0.805 |
| 2019-01-04 | 2.319 | 2.327 | -0.798 | -0.795 |
| 2019-01-07 | 2.32 | 2.329 | -0.787 | -0.785 |
| 2019-01-08 | 2.32 | 2.329 | -0.787 | -0.785 |
| 2019-01-09 | 2.318 | 2.328 | -0.789 | -0.829 |
| 2019-01-10 | 2.318 | 2.328 | -0.787 | -0.809 |
| 2019-01-11 | 2.318 | 2.328 | -0.787 | -0.809 |
| 2019-01-14 | 2.318 | 2.328 | -0.769 | -0.801 |
| 2019-01-15 | 2.318 | 2.328 | -0.769 | -0.801 |
| 2019-01-16 | 2.318 | 2.327 | -0.77 | -0.82 |
| 2019-01-17 | 2.318 | 2.327 | -0.77 | -0.82 |
| 2019-01-18 | 2.318 | 2.336 | -0.751 | -0.81 |
| 2019-01-21 | 2.318 | 2.336 | -0.751 | -0.81 |
| 2019-01-22 | 2.318 | 2.335 | -0.769 | -0.817 |
| 2019-01-23 | 2.318 | 2.336 | -0.761 | -0.815 |
| 2019-01-24 | 2.306 | 2.335 | -0.765 | -0.809 |
| 2019-01-25 | 2.306 | 2.335 | -0.765 | -0.809 |
| 2019-01-28 | 2.307 | 2.332 | -0.751 | -0.81 |
| 2019-01-29 | 2.296 | 2.329 | -0.754 | -0.804 |
| 2019-01-30 | 2.296 | 2.319 | -0.754 | -0.814 |
| 2019-01-31 | 2.298 | 2.319 | -0.747 | -0.773 |
| 2019-02-01 | 2.298 | 2.32 | -0.743 | -0.752 |
| 2019-02-04 | 2.298 | 2.31 | -0.743 | -0.762 |
| 2019-02-05 | 2.298 | 2.31 | -0.743 | -0.762 |
| 2019-02-06 | 2.298 | 2.308 | -0.748 | -0.762 |
| 2019-02-07 | 2.298 | 2.308 | -0.707 | -0.748 |
| 2019-02-08 | 2.298 | 2.309 | -0.708 | -0.736 |
| 2019-02-11 | 2.298 | 2.309 | -0.698 | -0.724 |
| 2019-02-12 | 2.298 | 2.309 | -0.698 | -0.724 |
| 2019-02-13 | 2.308 | 2.298 | -0.684 | -0.726 |
| 2019-02-14 | 2.308 | 2.298 | -0.694 | -0.727 |
| 2019-02-15 | 2.318 | 2.298 | -0.684 | -0.727 |
| 2019-02-18 | 2.328 | 2.298 | -0.624 | -0.717 |
| 2019-02-19 | 2.328 | 2.298 | -0.624 | -0.717 |
| 2019-02-20 | 2.328 | 2.298 | -0.643 | -0.684 |
| 2019-02-21 | 2.33 | 2.298 | -0.631 | -0.699 |
| 2019-02-22 | 2.33 | 2.298 | -0.626 | -0.702 |
| 2019-02-25 | 2.329 | 2.308 | -0.619 | -0.683 |
| 2019-02-26 | 2.329 | 2.308 | -0.619 | -0.683 |
| 2019-02-27 | 2.33 | 2.308 | -0.606 | -0.666 |
| 2019-02-28 | 2.329 | 2.308 | -0.595 | -0.665 |
| 2019-03-01 | 2.339 | 2.308 | -0.585 | -0.665 |
| 2019-03-04 | 2.339 | 2.308 | -0.578 | -0.683 |
| 2019-03-05 | 2.338 | 2.308 | -0.577 | -0.684 |
| 2019-03-06 | 2.338 | 2.308 | -0.577 | -0.684 |
| 2019-03-07 | 2.338 | 2.318 | -0.577 | -0.674 |
| 2019-03-08 | 2.338 | 2.308 | -0.577 | -0.684 |
| 2019-03-11 | 2.338 | 2.308 | -0.578 | -0.669 |
| 2019-03-12 | 2.339 | 2.308 | -0.563 | -0.668 |
| 2019-03-13 | 2.34 | 2.309 | -0.581 | -0.659 |
| 2019-03-14 | 2.339 | 2.309 | -0.585 | -0.646 |
| 2019-03-15 | 2.339 | 2.309 | -0.585 | -0.646 |
| 2019-03-18 | 2.34 | 2.309 | -0.603 | -0.618 |
| 2019-03-19 | 2.34 | 2.309 | -0.603 | -0.618 |
| 2019-03-20 | 2.339 | 2.309 | -0.577 | -0.613 |
| 2019-03-21 | 2.339 | 2.308 | -0.572 | -0.594 |
| 2019-03-22 | 2.339 | 2.308 | -0.58 | -0.587 |
| 2019-03-25 | 2.33 | 2.308 | -0.589 | -0.546 |
| 2019-03-26 | 2.329 | 2.308 | -0.577 | -0.525 |
| 2019-03-27 | 2.329 | 2.309 | -0.581 | -0.483 |
| 2019-03-28 | 2.329 | 2.309 | -0.581 | -0.483 |
| 2019-03-29 | 2.331 | 2.312 | -0.58 | -0.511 |
| 2019-04-01 | 2.33 | 2.312 | -0.575 | -0.53 |
| 2019-04-02 | 2.331 | 2.312 | -0.582 | -0.533 |
| 2019-04-03 | 2.33 | 2.312 | -0.578 | -0.549 |
| 2019-04-04 | 2.33 | 2.312 | -0.569 | -0.536 |
| 2019-04-05 | 2.33 | 2.312 | -0.572 | -0.551 |
| 2019-04-08 | 2.33 | 2.312 | -0.564 | -0.55 |
| 2019-04-09 | 2.33 | 2.312 | -0.561 | -0.554 |
| 2019-04-10 | 2.33 | 2.312 | -0.583 | -0.54 |
| 2019-04-11 | 2.33 | 2.312 | -0.577 | -0.534 |
| 2019-04-12 | 2.33 | 2.322 | -0.581 | -0.538 |
| 2019-04-15 | 2.33 | 2.321 | -0.568 | -0.545 |
| 2019-04-16 | 2.33 | 2.322 | -0.581 | -0.545 |
| 2019-04-17 | 2.331 | 2.322 | -0.571 | -0.552 |
| 2019-04-18 | 2.331 | 2.322 | -0.571 | -0.552 |
| 2019-04-23 | 2.331 | 2.332 | -0.56 | -0.516 |
| 2019-04-24 | 2.332 | 2.332 | -0.566 | -0.505 |
| 2019-04-25 | 2.332 | 2.332 | -0.562 | -0.496 |
| 2019-04-26 | 2.34 | 2.343 | -0.553 | -0.487 |
| 2019-04-29 | 2.351 | 2.344 | -0.539 | -0.483 |
| 2019-04-30 | 2.36 | 2.344 | -0.526 | -0.487 |
| 2019-05-02 | 2.359 | 2.344 | -0.515 | -0.507 |
| 2019-05-03 | 2.509 | 2.454 | -0.36 | -0.406 |
| 2019-05-06 | 2.518 | 2.454 | -0.35 | -0.406 |
| 2019-05-07 | 2.518 | 2.455 | -0.352 | -0.381 |
| 2019-05-09 | 2.518 | 2.455 | -0.352 | -0.381 |
| 2019-05-10 | 2.509 | 2.458 | -0.328 | -0.353 |
| 2019-05-13 | 2.511 | 2.448 | -0.318 | -0.342 |
| 2019-05-14 | 2.511 | 2.451 | -0.324 | -0.309 |
| 2019-05-15 | 2.511 | 2.445 | -0.325 | -0.312 |
| 2019-05-16 | 2.512 | 2.448 | -0.32 | -0.294 |
| 2019-05-17 | 2.512 | 2.448 | -0.32 | -0.294 |
| 2019-05-20 | 2.514 | 2.455 | -0.323 | -0.327 |
| 2019-05-21 | 2.513 | 2.465 | -0.323 | -0.334 |
| 2019-05-22 | 2.511 | 2.465 | -0.325 | -0.346 |
| 2019-05-23 | 2.5 | 2.458 | -0.331 | -0.335 |
| 2019-05-24 | 2.5 | 2.458 | -0.331 | -0.335 |
| 2019-05-27 | 2.5 | 2.458 | -0.331 | -0.335 |
| 2019-05-28 | 2.505 | 2.463 | -0.334 | -0.29 |
| 2019-05-29 | 2.505 | 2.463 | -0.334 | -0.29 |
| 2019-05-30 | 2.512 | 2.478 | -0.312 | -0.2 |
| 2019-05-31 | 2.512 | 2.478 | -0.312 | -0.2 |
| 2019-06-03 | 2.513 | 2.485 | -0.288 | -0.103 |
| 2019-06-04 | 2.502 | 2.477 | -0.294 | -0.105 |
| 2019-06-05 | 2.5 | 2.477 | -0.292 | -0.083 |
| 2019-06-06 | 2.5 | 2.477 | -0.292 | -0.083 |
| 2019-06-07 | 2.499 | 2.475 | -0.271 | -0.046 |
| 2019-06-10 | 2.488 | 2.468 | -0.266 | -0.048 |
| 2019-06-11 | 2.489 | 2.468 | -0.28 | -0.053 |
| 2019-06-12 | 2.488 | 2.463 | -0.258 | -0.043 |
| 2019-06-13 | 2.488 | 2.458 | -0.24 | -0.016 |
| 2019-06-14 | 2.488 | 2.461 | -0.232 | 0.043 |
| 2019-06-17 | 2.49 | 2.467 | -0.248 | 0.003 |
| 2019-06-18 | 2.492 | 2.474 | -0.217 | 0.026 |
| 2019-06-19 | 2.506 | 2.498 | -0.216 | -0.008 |
| 2019-06-20 | 2.508 | 2.501 | -0.173 | 0.128 |
| 2019-06-21 | 2.514 | 2.502 | -0.179 | 0.088 |
| 2019-06-24 | 2.513 | 2.5 | -0.163 | 0.111 |
| 2019-06-25 | 2.515 | 2.5 | -0.141 | 0.143 |
| 2019-06-26 | 2.515 | 2.5 | -0.141 | 0.143 |
| 2019-06-27 | 2.514 | 2.503 | -0.149 | 0.105 |
| 2019-06-28 | 2.515 | 2.504 | -0.15 | 0.112 |
| 2019-07-01 | 2.516 | 2.507 | -0.162 | 0.088 |
| 2019-07-02 | 2.521 | 2.523 | -0.143 | 0.087 |
| 2019-07-03 | 2.523 | 2.533 | -0.119 | 0.11 |
| 2019-07-04 | 2.524 | 2.548 | -0.133 | 0.111 |
| 2019-07-08 | 2.526 | 2.548 | -0.168 | 0.029 |
| 2019-07-09 | 2.528 | 2.538 | -0.171 | 0.007 |
| 2019-07-10 | 2.528 | 2.533 | -0.17 | -0.006 |
| 2019-07-11 | 2.534 | 2.557 | -0.133 | 0.087 |
| 2019-07-12 | 2.533 | 2.56 | -0.152 | 0.049 |
| 2019-07-15 | 2.523 | 2.567 | -0.143 | 0.07 |
| 2019-07-16 | 2.523 | 2.567 | -0.143 | 0.07 |
| 2019-07-17 | 2.529 | 2.578 | -0.143 | 0.063 |
| 2019-07-18 | 2.53 | 2.583 | -0.118 | 0.088 |
| 2019-07-19 | 2.535 | 2.588 | -0.099 | 0.122 |
| 2019-07-22 | 2.534 | 2.587 | -0.123 | 0.092 |
| 2019-07-23 | 2.533 | 2.591 | -0.115 | 0.089 |
| 2019-07-24 | 2.536 | 2.601 | -0.107 | 0.101 |
| 2019-07-25 | 2.536 | 2.601 | -0.107 | 0.101 |
| 2019-07-26 | 2.528 | 2.584 | -0.106 | 0.073 |
| 2019-07-29 | 2.527 | 2.584 | -0.095 | 0.072 |
| 2019-07-30 | 2.534 | 2.571 | -0.093 | 0.082 |
| 2019-07-31 | 2.535 | 2.573 | -0.106 | 0.081 |
| 2019-08-01 | 2.537 | 2.57 | -0.127 | 0.031 |
| 2019-08-02 | 2.54 | 2.564 | -0.079 | 0.144 |
| 2019-08-05 | 2.534 | 2.558 | -0.059 | 0.213 |
| 2019-08-06 | 2.539 | 2.569 | -0.037 | 0.256 |
| 2019-08-07 | 2.54 | 2.562 | -0.034 | 0.263 |
| 2019-08-08 | 2.538 | 2.579 | -0.041 | 0.247 |
| 2019-08-09 | 2.544 | 2.573 | -0.036 | 0.242 |
| 2019-08-12 | 2.54 | 2.582 | -0.035 | 0.239 |
| 2019-08-13 | 2.542 | 2.577 | -0.018 | 0.25 |
| 2019-08-14 | 2.546 | 2.56 | -0.028 | 0.181 |
| 2019-08-15 | 2.544 | 2.563 | 0.016 | 0.277 |
| 2019-08-16 | 2.56 | 2.585 | 0.004 | 0.255 |
| 2019-08-19 | 2.562 | 2.608 | -0.011 | 0.257 |
| 2019-08-20 | 2.561 | 2.605 | -0.01 | 0.262 |
| 2019-08-21 | 2.563 | 2.609 | -0.008 | 0.256 |
| 2019-08-22 | 2.558 | 2.586 | 0.008 | 0.227 |
| 2019-08-23 | 2.552 | 2.558 | -0.004 | 0.172 |
| 2019-08-26 | 2.552 | 2.558 | -0.004 | 0.172 |
| 2019-08-27 | 2.558 | 2.569 | 0.023 | 0.251 |
| 2019-08-28 | 2.558 | 2.569 | 0.023 | 0.251 |
| 2019-08-29 | 2.558 | 2.569 | 0.023 | 0.251 |
| 2019-08-30 | 2.558 | 2.569 | 0.023 | 0.251 |
| 2019-09-02 | 2.558 | 2.569 | 0.023 | 0.251 |
| 2019-09-03 | 2.558 | 2.569 | 0.023 | 0.251 |
| 2019-09-04 | 2.583 | 2.579 | 0.028 | 0.303 |
| 2019-09-05 | 2.583 | 2.579 | 0.028 | 0.303 |
| 2019-09-06 | 2.577 | 2.558 | 0.006 | 0.251 |
| 2019-09-09 | 2.573 | 2.56 | 0.002 | 0.251 |
| 2019-09-10 | 2.575 | 2.57 | 0.008 | 0.23 |
| 2019-09-11 | 2.57 | 2.573 | 0.013 | 0.191 |
| 2019-09-12 | 2.57 | 2.573 | 0.013 | 0.191 |
| 2019-09-13 | 2.54 | 2.525 | 0.001 | 0.151 |
| 2019-09-16 | 2.534 | 2.509 | -0.005 | 0.13 |
| 2019-09-17 | 2.534 | 2.509 | -0.005 | 0.13 |
| 2019-09-18 | 2.536 | 2.506 | -0.016 | 0.136 |
| 2019-09-19 | 2.536 | 2.506 | -0.016 | 0.136 |
| 2019-09-20 | 2.536 | 2.506 | -0.016 | 0.136 |
| 2019-09-23 | 2.54 | 2.502 | 0.034 | 0.167 |
| 2019-09-24 | 2.54 | 2.502 | 0.034 | 0.167 |
| 2019-09-25 | 2.54 | 2.502 | 0.034 | 0.167 |
| 2019-09-26 | 2.563 | 2.544 | 0.046 | 0.2 |
| 2019-09-27 | 2.572 | 2.555 | 0.061 | 0.187 |
| 2019-09-30 | 2.578 | 2.57 | 0.075 | 0.208 |
| 2019-10-01 | 2.588 | 2.58 | 0.071 | 0.215 |
| 2019-10-02 | 2.585 | 2.583 | 0.104 | 0.302 |
| 2019-10-03 | 2.595 | 2.588 | 0.127 | 0.346 |
| 2019-10-04 | 2.593 | 2.586 | 0.143 | 0.397 |
| 2019-10-07 | 2.593 | 2.596 | 0.158 | 0.392 |
| 2019-10-08 | 2.587 | 2.6 | 0.16 | 0.381 |
| 2019-10-09 | 2.588 | 2.603 | 0.186 | 0.388 |
| 2019-10-10 | 2.588 | 2.596 | 0.184 | 0.374 |
| 2019-10-11 | 2.588 | 2.573 | 0.169 | 0.314 |
| 2019-10-14 | 2.586 | 2.581 | 0.169 | 0.307 |
| 2019-10-15 | 2.588 | 2.583 | 0.168 | 0.306 |
| 2019-10-16 | 2.59 | 2.589 | 0.177 | 0.298 |
| 2019-10-17 | 2.59 | 2.584 | 0.214 | 0.297 |
| 2019-10-18 | 2.587 | 2.588 | 0.227 | 0.303 |
| 2019-10-21 | 2.588 | 2.584 | 0.246 | 0.329 |
| 2019-10-22 | 2.584 | 2.574 | 0.244 | 0.323 |
| 2019-10-23 | 2.582 | 2.578 | 0.24 | 0.347 |
| 2019-10-24 | 2.584 | 2.568 | 0.244 | 0.319 |
| 2019-10-25 | 2.593 | 2.573 | 0.252 | 0.324 |
| 2019-10-29 | 2.585 | 2.56 | 0.253 | 0.291 |
| 2019-10-30 | 2.581 | 2.556 | 0.271 | 0.3 |
| 2019-10-31 | 2.574 | 2.553 | 0.278 | 0.325 |
| 2019-11-01 | 2.569 | 2.551 | 0.279 | 0.345 |
| 2019-11-04 | 2.578 | 2.556 | 0.272 | 0.32 |
| 2019-11-05 | 2.583 | 2.558 | 0.287 | 0.313 |
| 2019-11-06 | 2.586 | 2.549 | 0.276 | 0.303 |
| 2019-11-07 | 2.58 | 2.55 | 0.279 | 0.297 |
| 2019-11-08 | 2.585 | 2.552 | 0.289 | 0.29 |
| 2019-11-11 | 2.574 | 2.553 | 0.275 | 0.296 |
| 2019-11-12 | 2.578 | 2.545 | 0.271 | 0.284 |
| 2019-11-13 | 2.582 | 2.551 | 0.27 | 0.303 |
| 2019-11-14 | 2.569 | 2.546 | 0.266 | 0.309 |
| 2019-11-15 | 2.574 | 2.549 | 0.267 | 0.319 |
| 2019-11-18 | 2.583 | 2.557 | 0.282 | 0.337 |
| 2019-11-19 | 2.588 | 2.561 | 0.285 | 0.348 |
| 2019-11-20 | 2.586 | 2.553 | 0.281 | 0.371 |
| 2019-11-21 | 2.588 | 2.56 | 0.271 | 0.371 |
| 2019-11-22 | 2.583 | 2.557 | 0.263 | 0.365 |
| 2019-11-25 | 2.584 | 2.56 | 0.261 | 0.338 |
| 2019-11-26 | 2.579 | 2.559 | 0.271 | 0.338 |
| 2019-11-27 | 2.58 | 2.558 | 0.266 | 0.34 |
| 2019-11-28 | 2.577 | 2.563 | 0.273 | 0.33 |
| 2019-11-29 | 2.581 | 2.553 | 0.275 | 0.328 |
| 2019-12-02 | 2.58 | 2.55 | 0.28 | 0.318 |
| 2019-12-03 | 2.577 | 2.533 | 0.289 | 0.333 |
| 2019-12-04 | 2.573 | 2.527 | 0.293 | 0.343 |
| 2019-12-05 | 2.575 | 2.529 | 0.295 | 0.337 |
| 2019-12-06 | 2.573 | 2.529 | 0.29 | 0.337 |
| 2019-12-09 | 2.572 | 2.537 | 0.292 | 0.325 |
| 2019-12-10 | 2.573 | 2.529 | 0.293 | 0.327 |
| 2019-12-11 | 2.573 | 2.532 | 0.293 | 0.317 |
| 2019-12-12 | 2.575 | 2.526 | 0.286 | 0.327 |
| 2019-12-13 | 2.58 | 2.533 | 0.28 | 0.306 |
| 2019-12-16 | 2.576 | 2.532 | 0.282 | 0.31 |
| 2019-12-17 | 2.58 | 2.533 | 0.278 | 0.302 |
| 2019-12-18 | 2.583 | 2.539 | 0.272 | 0.3 |
| 2019-12-19 | 2.578 | 2.532 | 0.252 | 0.272 |
| 2019-12-20 | 2.568 | 2.523 | 0.245 | 0.27 |
| 2019-12-23 | 2.579 | 2.52 | 0.233 | 0.268 |
| 2019-12-27 | 2.57 | 2.517 | 0.235 | 0.266 |
| 2019-12-30 | 2.568 | 2.51 | 0.271 | 0.269 |
| 2019-12-31 | 2.563 | 2.519 | 0.272 | 0.274 |
| 2020-01-02 | 2.559 | 2.518 | 0.28 | 0.275 |
| 2020-01-03 | 2.554 | 2.508 | 0.296 | 0.306 |
| 2020-01-06 | 2.555 | 2.518 | 0.298 | 0.315 |
| 2020-01-07 | 2.557 | 2.518 | 0.292 | 0.316 |
| 2020-01-08 | 2.56 | 2.521 | 0.336 | 0.319 |
| 2020-01-09 | 2.563 | 2.53 | 0.322 | 0.301 |
| 2020-01-10 | 2.565 | 2.523 | 0.332 | 0.303 |
| 2020-01-13 | 2.559 | 2.516 | 0.339 | 0.308 |
| 2020-01-14 | 2.561 | 2.523 | 0.327 | 0.317 |
| 2020-01-15 | 2.563 | 2.532 | 0.334 | 0.327 |
| 2020-01-16 | 2.563 | 2.531 | 0.343 | 0.35 |
| 2020-01-17 | 2.561 | 2.522 | 0.351 | 0.357 |
| 2020-01-20 | 2.562 | 2.524 | 0.368 | 0.355 |
| 2020-01-21 | 2.562 | 2.523 | 0.364 | 0.362 |
| 2020-01-22 | 2.56 | 2.522 | 0.369 | 0.361 |
| 2020-01-23 | 2.556 | 2.527 | 0.376 | 0.386 |
| 2020-01-24 | 2.556 | 2.538 | 0.375 | 0.4 |
| 2020-01-27 | 2.568 | 2.53 | 0.395 | 0.433 |
| 2020-01-28 | 2.571 | 2.54 | 0.4 | 0.439 |
| 2020-01-29 | 2.569 | 2.539 | 0.393 | 0.423 |
| 2020-01-30 | 2.558 | 2.548 | 0.397 | 0.448 |
| 2020-01-31 | 2.553 | 2.554 | 0.409 | 0.463 |
| 2020-02-03 | 2.553 | 2.56 | 0.419 | 0.501 |
| 2020-02-04 | 2.556 | 2.558 | 0.423 | 0.467 |
| 2020-02-05 | 2.56 | 2.548 | 0.418 | 0.439 |
| 2020-02-06 | 2.559 | 2.54 | 0.426 | 0.427 |
| 2020-02-07 | 2.79 | 2.749 | 0.659 | 0.645 |
| 2020-02-10 | 2.787 | 2.739 | 0.677 | 0.669 |
| 2020-02-11 | 2.799 | 2.736 | 0.683 | 0.653 |
| 2020-02-12 | 2.803 | 2.738 | 0.686 | 0.637 |
| 2020-02-13 | 2.801 | 2.737 | 0.698 | 0.648 |
| 2020-02-14 | 2.803 | 2.743 | 0.698 | 0.652 |
| 2020-02-17 | 2.803 | 2.744 | 0.697 | 0.657 |
| 2020-02-18 | 2.793 | 2.742 | 0.695 | 0.678 |
| 2020-02-19 | 2.792 | 2.738 | 0.694 | 0.681 |
| 2020-02-20 | 2.8 | 2.744 | 0.707 | 0.688 |
| 2020-02-21 | 2.805 | 2.737 | 0.711 | 0.721 |
| 2020-02-24 | 2.804 | 2.734 | 0.743 | 0.815 |
| 2020-02-25 | 2.807 | 2.745 | 0.752 | 0.804 |
| 2020-02-26 | 2.813 | 2.756 | 0.777 | 0.84 |
| 2020-02-27 | 2.815 | 2.753 | 0.81 | 0.913 |
| 2020-02-28 | 2.804 | 2.741 | 0.917 | 1.049 |
| 2020-03-02 | 2.804 | 2.737 | 1.116 | 1.256 |
| 2020-03-03 | 2.813 | 2.742 | 1.036 | 1.134 |
| 2020-03-04 | 2.808 | 2.729 | 1.339 | 1.402 |
| 2020-03-05 | 2.809 | 2.732 | 1.341 | 1.426 |
| 2020-03-06 | 2.813 | 2.718 | 1.444 | 1.524 |
| 2020-03-09 | 2.808 | 2.712 | 1.572 | 1.616 |
| 2020-03-10 | 2.822 | 2.718 | 1.556 | 1.568 |
| 2020-03-11 | 2.803 | 2.699 | 1.558 | 1.613 |
| 2020-03-12 | 2.809 | 2.708 | 1.58 | 1.58 |
| 2020-03-13 | 2.738 | 2.627 | 1.467 | 1.518 |
| 2020-03-16 | 2.72 | 2.598 | 1.421 | 1.511 |
| 2020-03-17 | 2.238 | 2.113 | 0.778 | 0.988 |
| 2020-03-18 | 2.208 | 2.053 | 0.684 | 0.911 |
| 2020-03-19 | 2.183 | 1.991 | 0.595 | 0.848 |
| 2020-03-20 | 2.151 | 1.956 | 0.576 | 0.836 |
| 2020-03-23 | 2.129 | 1.941 | 0.544 | 0.813 |
| 2020-03-24 | 2.113 | 1.909 | 0.508 | 0.763 |
| 2020-03-25 | 2.089 | 1.886 | 0.453 | 0.722 |
| 2020-03-26 | 2.059 | 1.828 | 0.335 | 0.707 |
| 2020-03-27 | 1.433 | 1.263 | -0.37 | 0.142 |
| 2020-03-30 | 1.393 | 1.203 | -0.393 | 0.026 |
| 2020-03-31 | 1.393 | 1.171 | -0.42 | 0.002 |
| 2020-04-01 | 1.363 | 1.148 | -0.417 | -0.022 |
| 2020-04-02 | 1.356 | 1.133 | -0.353 | -0.08 |
| 2020-04-03 | 1.351 | 1.119 | -0.377 | -0.08 |
| 2020-04-06 | 1.328 | 1.104 | -0.342 | -0.073 |
| 2020-04-07 | 1.303 | 1.092 | -0.31 | -0.075 |
| 2020-04-08 | 1.254 | 1.06 | -0.311 | -0.083 |
| 2020-04-09 | 1.22 | 1.057 | -0.219 | -0.081 |
| 2020-04-14 | 1.228 | 1.045 | -0.196 | -0.086 |
| 2020-04-15 | 1.23 | 1.04 | -0.155 | -0.084 |
| 2020-04-16 | 1.194 | 1.018 | -0.165 | -0.061 |
| 2020-04-17 | 1.213 | 1.015 | -0.139 | -0.072 |
| 2020-04-20 | 1.216 | 1.001 | -0.128 | -0.072 |
| 2020-04-21 | 1.193 | 0.968 | -0.083 | -0.097 |
| 2020-04-22 | 1.14 | 0.933 | -0.07 | -0.09 |
| 2020-04-23 | 1.091 | 0.946 | -0.061 | -0.08 |
| 2020-04-24 | 1.102 | 0.953 | 0.023 | -0.07 |
| 2020-04-27 | 1.123 | 0.979 | 0.059 | -0.055 |
| 2020-04-28 | 1.132 | 0.984 | 0.14 | -0.04 |
| 2020-04-29 | 1.161 | 0.991 | 0.213 | -0.039 |
| 2020-04-30 | 1.173 | 0.978 | 0.344 | -0.005 |
| 2020-05-04 | 1.186 | 0.968 | 0.399 | 0.031 |
| 2020-05-05 | 1.197 | 0.958 | 0.426 | 0.019 |
| 2020-05-06 | 1.156 | 0.918 | 0.442 | 0.032 |
| 2020-05-07 | 1.128 | 0.898 | 0.435 | 0.037 |
| 2020-05-11 | 0.608 | 0.515 | -0.084 | -0.336 |
| 2020-05-12 | 0.595 | 0.493 | -0.074 | -0.349 |
| 2020-05-13 | 0.603 | 0.478 | -0.042 | -0.359 |
| 2020-05-14 | 0.612 | 0.488 | -0.036 | -0.352 |
| 2020-05-15 | 0.606 | 0.488 | -0.04 | -0.345 |
| 2020-05-18 | 0.616 | 0.494 | -0.037 | -0.308 |
| 2020-05-19 | 0.599 | 0.485 | -0.034 | -0.312 |
| 2020-05-20 | 0.62 | 0.468 | -0.018 | -0.296 |
| 2020-05-21 | 0.622 | 0.488 | -0.019 | -0.275 |
| 2020-05-22 | 0.619 | 0.513 | -0.029 | -0.262 |
| 2020-05-25 | 0.615 | 0.503 | -0.029 | -0.262 |
| 2020-05-26 | 0.604 | 0.498 | -0.041 | -0.26 |
| 2020-05-27 | 0.62 | 0.496 | -0.022 | -0.26 |
| 2020-05-28 | 0.63 | 0.508 | -0.01 | -0.247 |
| 2020-05-29 | 0.647 | 0.515 | -0.004 | -0.244 |
| 2020-06-01 | 0.665 | 0.533 | 0.003 | -0.207 |
| 2020-06-02 | 0.67 | 0.537 | 0.01 | -0.195 |
| 2020-06-03 | 0.682 | 0.535 | 0.013 | -0.193 |
| 2020-06-04 | 0.692 | 0.542 | 0.022 | -0.198 |
| 2020-06-05 | 0.693 | 0.55 | 0.027 | -0.204 |
| 2020-06-08 | 0.705 | 0.55 | 0.03 | -0.2 |
| 2020-06-09 | 0.704 | 0.563 | 0.025 | -0.203 |
| 2020-06-10 | 0.691 | 0.548 | 0.022 | -0.215 |
| 2020-06-11 | 0.698 | 0.548 | 0.027 | -0.175 |
| 2020-06-12 | 0.706 | 0.554 | 0.019 | -0.163 |
| 2020-06-15 | 0.695 | 0.565 | 0.041 | -0.161 |
| 2020-06-16 | 0.712 | 0.565 | 0.032 | -0.156 |
| 2020-06-17 | 0.736 | 0.56 | 0.024 | -0.154 |
| 2020-06-18 | 0.729 | 0.577 | 0.034 | -0.147 |
| 2020-06-19 | 0.747 | 0.599 | 0.035 | -0.146 |
| 2020-06-22 | 0.74 | 0.609 | 0.043 | -0.144 |
| 2020-06-23 | 0.749 | 0.618 | 0.043 | -0.135 |
| 2020-06-24 | 0.738 | 0.614 | 0.056 | -0.134 |
| 2020-06-25 | 0.742 | 0.618 | 0.034 | -0.14 |
| 2020-06-26 | 0.743 | 0.629 | 0.032 | -0.136 |
| 2020-06-29 | 0.753 | 0.635 | 0.044 | -0.126 |
| 2020-06-30 | 0.762 | 0.655 | 0.038 | -0.116 |
| 2020-07-01 | 0.757 | 0.663 | 0.042 | -0.103 |
| 2020-07-02 | 0.769 | 0.667 | 0.036 | -0.109 |
| 2020-07-03 | 0.775 | 0.668 | 0.064 | -0.076 |
| 2020-07-07 | 0.776 | 0.688 | 0.072 | -0.062 |
| 2020-07-08 | 0.773 | 0.693 | 0.067 | -0.058 |
| 2020-07-09 | 0.778 | 0.693 | 0.074 | -0.054 |
| 2020-07-10 | 0.78 | 0.714 | 0.072 | -0.05 |
| 2020-07-13 | 0.775 | 0.71 | 0.065 | -0.051 |
| 2020-07-14 | 0.773 | 0.701 | 0.069 | -0.051 |
| 2020-07-15 | 0.783 | 0.703 | 0.067 | -0.047 |
| 2020-07-16 | 0.789 | 0.712 | 0.068 | -0.045 |
| 2020-07-17 | 0.783 | 0.72 | 0.069 | -0.04 |
| 2020-07-20 | 0.783 | 0.709 | 0.082 | -0.039 |
| 2020-07-21 | 0.792 | 0.71 | 0.085 | -0.034 |
| 2020-07-22 | 0.794 | 0.713 | 0.077 | -0.033 |
| 2020-07-23 | 0.793 | 0.716 | 0.096 | -0.032 |
| 2020-07-24 | 0.788 | 0.722 | 0.093 | -0.03 |
| 2020-07-27 | 0.797 | 0.718 | 0.07 | -0.027 |
| 2020-07-28 | 0.794 | 0.737 | 0.072 | -0.031 |
| 2020-07-29 | 0.798 | 0.753 | 0.079 | -0.031 |
| 2020-07-30 | 0.801 | 0.758 | 0.089 | -0.027 |
| 2020-07-31 | 0.803 | 0.763 | 0.091 | -0.019 |